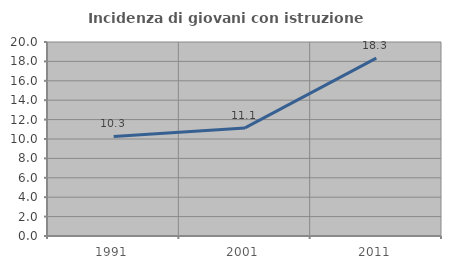
| Category | Incidenza di giovani con istruzione universitaria |
|---|---|
| 1991.0 | 10.26 |
| 2001.0 | 11.145 |
| 2011.0 | 18.342 |